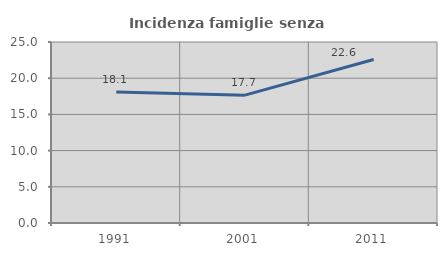
| Category | Incidenza famiglie senza nuclei |
|---|---|
| 1991.0 | 18.092 |
| 2001.0 | 17.661 |
| 2011.0 | 22.591 |